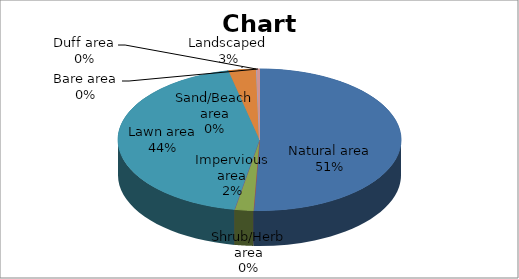
| Category | Series 0 |
|---|---|
| Natural area | 1308543.25 |
| Shrub/Herb area | 0 |
| Impervious area | 55587 |
| Sand/Beach area | 0 |
| Lawn area | 1127456.75 |
| Landscaped | 82134.5 |
| Duff area | 0 |
| Bare area | 8963.5 |